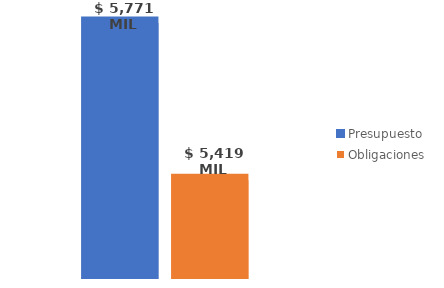
| Category | Presupuesto | Obligaciones |
|---|---|---|
| Total | 5770920208493.648 | 5418731857229.174 |